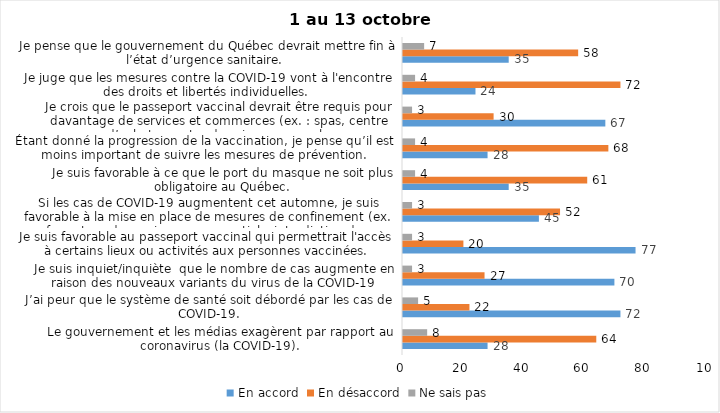
| Category | En accord | En désaccord | Ne sais pas |
|---|---|---|---|
| Le gouvernement et les médias exagèrent par rapport au coronavirus (la COVID-19). | 28 | 64 | 8 |
| J’ai peur que le système de santé soit débordé par les cas de COVID-19. | 72 | 22 | 5 |
| Je suis inquiet/inquiète  que le nombre de cas augmente en raison des nouveaux variants du virus de la COVID-19 | 70 | 27 | 3 |
| Je suis favorable au passeport vaccinal qui permettrait l'accès à certains lieux ou activités aux personnes vaccinées. | 77 | 20 | 3 |
| Si les cas de COVID-19 augmentent cet automne, je suis favorable à la mise en place de mesures de confinement (ex. fermeture de services non essentiels, interdiction des rassemblements privés) | 45 | 52 | 3 |
| Je suis favorable à ce que le port du masque ne soit plus obligatoire au Québec. | 35 | 61 | 4 |
| Étant donné la progression de la vaccination, je pense qu’il est moins important de suivre les mesures de prévention. | 28 | 68 | 4 |
| Je crois que le passeport vaccinal devrait être requis pour davantage de services et commerces (ex. : spas, centre d’achats, centre de soins personnels. | 67 | 30 | 3 |
| Je juge que les mesures contre la COVID-19 vont à l'encontre des droits et libertés individuelles.  | 24 | 72 | 4 |
| Je pense que le gouvernement du Québec devrait mettre fin à l’état d’urgence sanitaire.  | 35 | 58 | 7 |